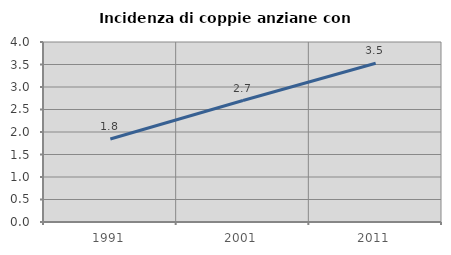
| Category | Incidenza di coppie anziane con figli |
|---|---|
| 1991.0 | 1.845 |
| 2001.0 | 2.699 |
| 2011.0 | 3.528 |